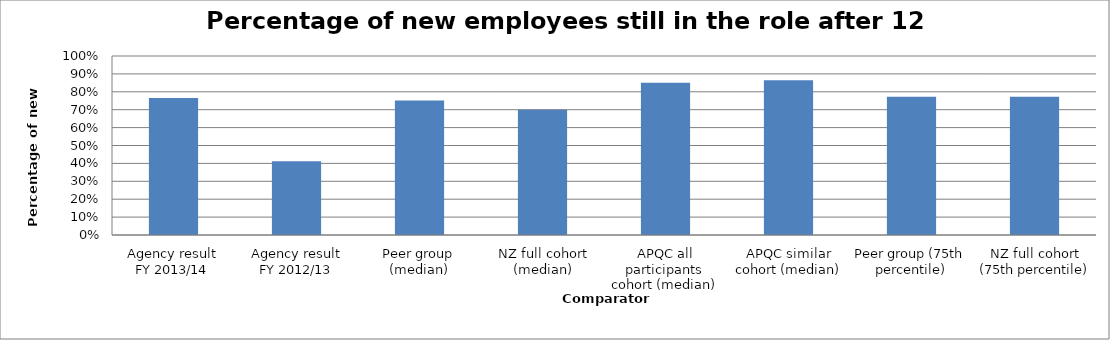
| Category | Result |
|---|---|
| Agency result
FY 2013/14 | 0.766 |
| Agency result
FY 2012/13 | 0.412 |
| Peer group (median) | 0.751 |
| NZ full cohort (median) | 0.7 |
| APQC all participants cohort (median) | 0.85 |
| APQC similar cohort (median) | 0.865 |
| Peer group (75th percentile) | 0.772 |
| NZ full cohort (75th percentile) | 0.772 |